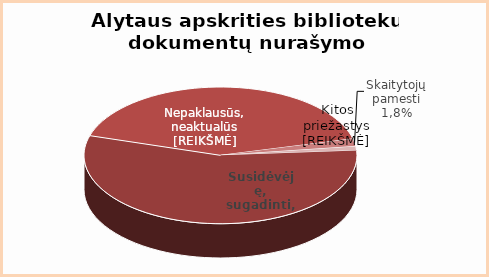
| Category | Series 0 |
|---|---|
| Susidėvėję | 0.557 |
| Nepaklausūs | 0.414 |
| Skaity | 0.018 |
| Kita | 0.01 |